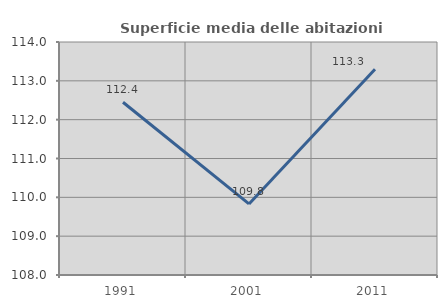
| Category | Superficie media delle abitazioni occupate |
|---|---|
| 1991.0 | 112.448 |
| 2001.0 | 109.83 |
| 2011.0 | 113.296 |